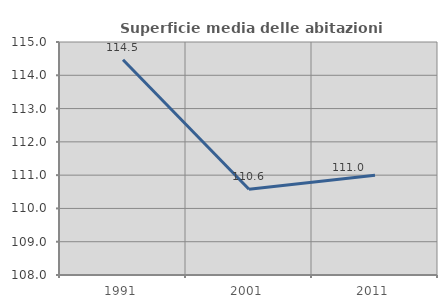
| Category | Superficie media delle abitazioni occupate |
|---|---|
| 1991.0 | 114.465 |
| 2001.0 | 110.577 |
| 2011.0 | 110.999 |